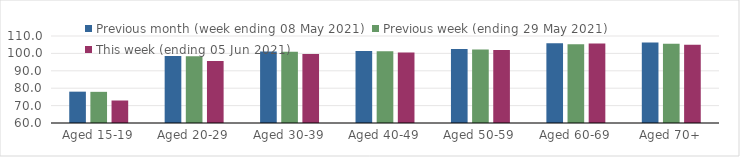
| Category | Previous month (week ending 08 May 2021) | Previous week (ending 29 May 2021) | This week (ending 05 Jun 2021) |
|---|---|---|---|
| Aged 15-19 | 78.01 | 77.91 | 72.93 |
| Aged 20-29 | 98.51 | 98.38 | 95.59 |
| Aged 30-39 | 101.13 | 100.91 | 99.66 |
| Aged 40-49 | 101.35 | 101.23 | 100.52 |
| Aged 50-59 | 102.46 | 102.23 | 101.96 |
| Aged 60-69 | 105.82 | 105.32 | 105.65 |
| Aged 70+ | 106.24 | 105.52 | 105.04 |